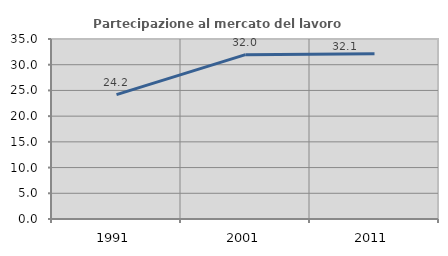
| Category | Partecipazione al mercato del lavoro  femminile |
|---|---|
| 1991.0 | 24.196 |
| 2001.0 | 31.955 |
| 2011.0 | 32.137 |